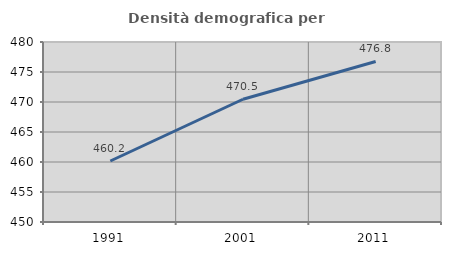
| Category | Densità demografica |
|---|---|
| 1991.0 | 460.169 |
| 2001.0 | 470.458 |
| 2011.0 | 476.755 |